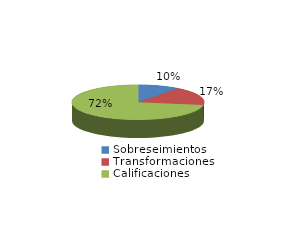
| Category | Series 0 |
|---|---|
| Sobreseimientos | 146 |
| Transformaciones | 251 |
| Calificaciones | 1043 |